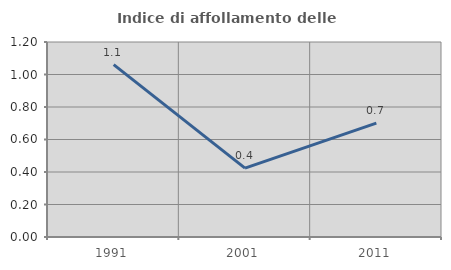
| Category | Indice di affollamento delle abitazioni  |
|---|---|
| 1991.0 | 1.061 |
| 2001.0 | 0.423 |
| 2011.0 | 0.701 |